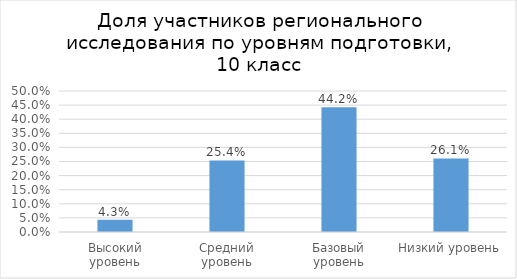
| Category | Series 0 |
|---|---|
| Высокий уровень | 0.043 |
| Средний уровень | 0.254 |
| Базовый уровень | 0.442 |
| Низкий уровень | 0.261 |